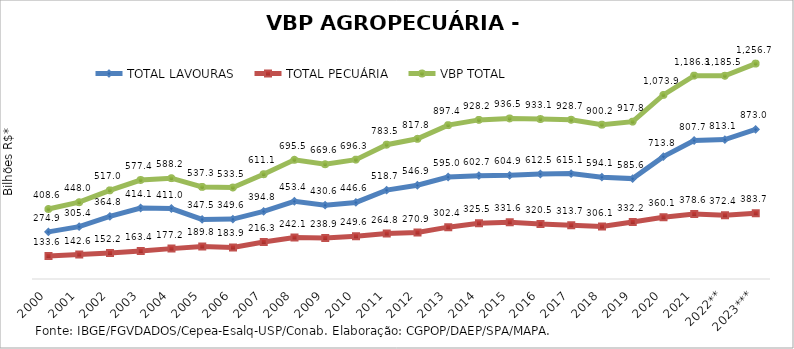
| Category | TOTAL LAVOURAS | TOTAL PECUÁRIA | VBP TOTAL |
|---|---|---|---|
| 2000 | 274.936 | 133.643 | 408.579 |
| 2001 | 305.403 | 142.581 | 447.983 |
| 2002 | 364.814 | 152.206 | 517.02 |
| 2003 | 414.061 | 163.366 | 577.428 |
| 2004 | 411.03 | 177.206 | 588.236 |
| 2005 | 347.507 | 189.831 | 537.338 |
| 2006 | 349.63 | 183.853 | 533.483 |
| 2007 | 394.843 | 216.293 | 611.136 |
| 2008 | 453.378 | 242.083 | 695.461 |
| 2009 | 430.649 | 238.935 | 669.584 |
| 2010 | 446.63 | 249.64 | 696.271 |
| 2011 | 518.706 | 264.805 | 783.511 |
| 2012 | 546.913 | 270.879 | 817.792 |
| 2013 | 595.045 | 302.404 | 897.449 |
| 2014 | 602.7 | 325.473 | 928.173 |
| 2015 | 604.887 | 331.568 | 936.455 |
| 2016 | 612.536 | 320.543 | 933.079 |
| 2017 | 615.079 | 313.656 | 928.735 |
| 2018 | 594.132 | 306.07 | 900.202 |
| 2019 | 585.588 | 332.174 | 917.762 |
| 2020 | 713.846 | 360.055 | 1073.901 |
| 2021 | 807.733 | 378.555 | 1186.289 |
| 2022** | 813.135 | 372.353 | 1185.488 |
| 2023*** | 873.041 | 383.656 | 1256.697 |